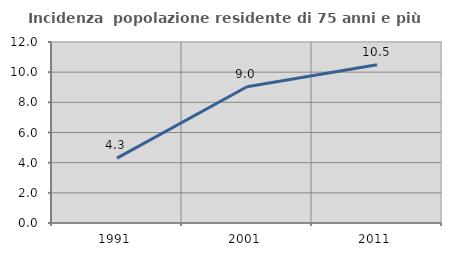
| Category | Incidenza  popolazione residente di 75 anni e più |
|---|---|
| 1991.0 | 4.299 |
| 2001.0 | 9.029 |
| 2011.0 | 10.491 |